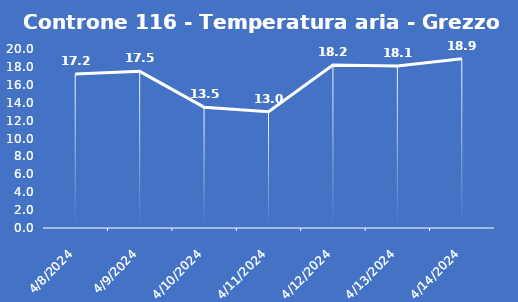
| Category | Controne 116 - Temperatura aria - Grezzo (°C) |
|---|---|
| 4/8/24 | 17.2 |
| 4/9/24 | 17.5 |
| 4/10/24 | 13.5 |
| 4/11/24 | 13 |
| 4/12/24 | 18.2 |
| 4/13/24 | 18.1 |
| 4/14/24 | 18.9 |